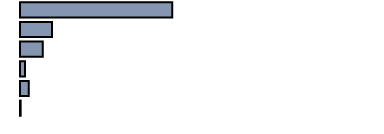
| Category | 38,0 |
|---|---|
| 0 | 42.644 |
| 1 | 8.93 |
| 2 | 6.394 |
| 3 | 1.415 |
| 4 | 2.418 |
| 5 | 0.18 |